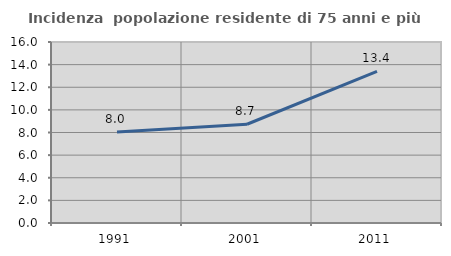
| Category | Incidenza  popolazione residente di 75 anni e più |
|---|---|
| 1991.0 | 8.043 |
| 2001.0 | 8.729 |
| 2011.0 | 13.399 |